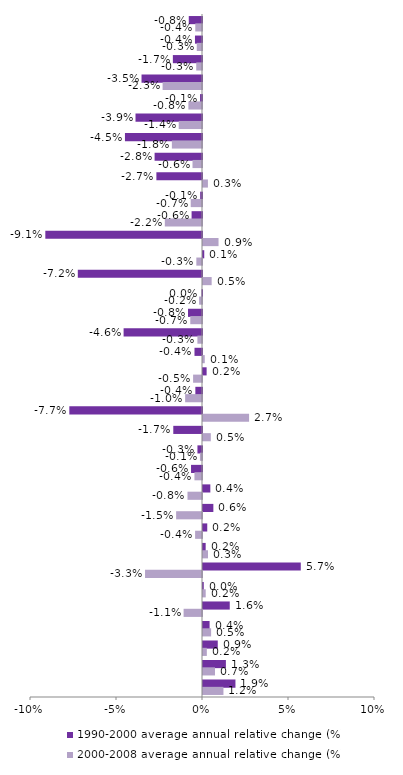
| Category | 1990-2000 average annual relative change (%) | 2000-2008 average annual relative change (%) |
|---|---|---|
| EU-27 | -0.008 | -0.004 |
| EU-15 | -0.004 | -0.003 |
| Germany | -0.017 | -0.003 |
| Czech Republic | -0.035 | -0.023 |
| United Kingdom | -0.001 | -0.008 |
| Slovakia | -0.039 | -0.014 |
| Bulgaria | -0.045 | -0.018 |
| Hungary | -0.028 | -0.006 |
| Romania | -0.027 | 0.003 |
| Poland | -0.001 | -0.007 |
| Sweden | -0.006 | -0.022 |
| Lithuania | -0.091 | 0.009 |
| France | 0.001 | -0.003 |
| Latvia | -0.072 | 0.005 |
| Italy | 0 | -0.002 |
| Finland | -0.008 | -0.007 |
| Luxembourg | -0.046 | -0.003 |
| Netherlands | -0.004 | 0.001 |
| Belgium | 0.002 | -0.005 |
| Denmark | -0.004 | -0.01 |
| Estonia | -0.077 | 0.027 |
| Croatia | -0.017 | 0.005 |
| Switzerland | -0.003 | -0.001 |
| Norway | -0.006 | -0.004 |
| Slovenia | 0.004 | -0.008 |
| Iceland | 0.006 | -0.015 |
| Malta | 0.002 | -0.004 |
| Liechtenstein | 0.002 | 0.003 |
| Cyprus | 0.057 | -0.033 |
| Austria | 0 | 0.002 |
| Portugal | 0.016 | -0.011 |
| Ireland | 0.004 | 0.005 |
| Greece | 0.009 | 0.002 |
| Spain | 0.013 | 0.007 |
| Turkey | 0.019 | 0.012 |